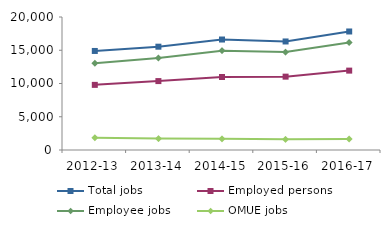
| Category | Total jobs | Employed persons | Employee jobs | OMUE jobs |
|---|---|---|---|---|
| 2012-13 | 14893 | 9794 | 13049 | 1844 |
| 2013-14 | 15535 | 10363 | 13822 | 1714 |
| 2014-15 | 16614 | 10974 | 14933 | 1680 |
| 2015-16 | 16321 | 11031 | 14721 | 1601 |
| 2016-17 | 17822 | 11937 | 16167 | 1655 |